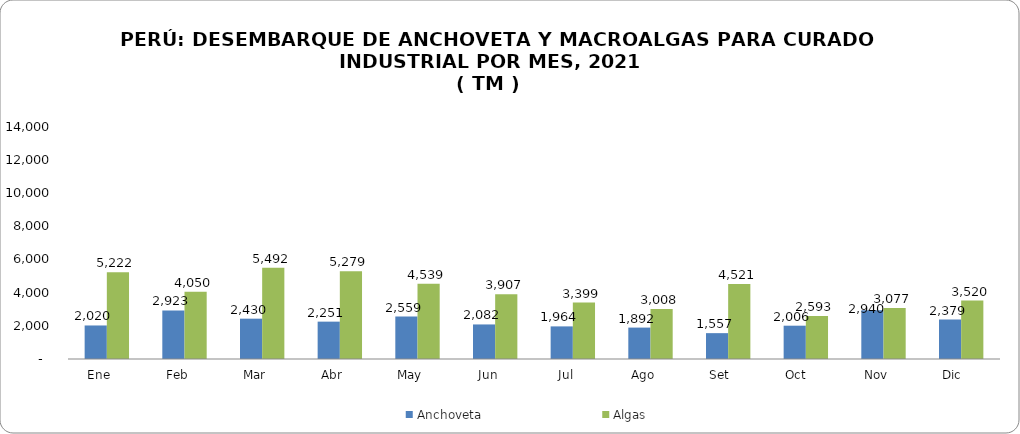
| Category | Anchoveta | Algas |
|---|---|---|
| Ene    | 2019.705 | 5221.99 |
| Feb    | 2923.422 | 4049.71 |
| Mar    | 2429.501 | 5492.06 |
| Abr    | 2250.571 | 5279.47 |
| May    | 2559.044 | 4539.17 |
| Jun    | 2081.956 | 3906.536 |
| Jul    | 1964.332 | 3399.006 |
| Ago    | 1892.125 | 3008.004 |
| Set     | 1557.488 | 4521.028 |
| Oct     | 2006.469 | 2592.562 |
| Nov    | 2940.092 | 3076.78 |
| Dic     | 2379.333 | 3520.021 |